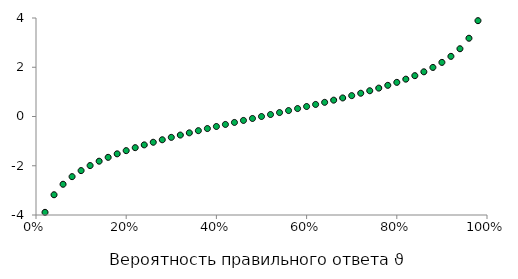
| Category | ln(k/(1-k)) |
|---|---|
| 1e-06 | -13.816 |
| 0.02 | -3.892 |
| 0.04 | -3.178 |
| 0.06 | -2.752 |
| 0.08 | -2.442 |
| 0.1 | -2.197 |
| 0.12 | -1.992 |
| 0.14 | -1.815 |
| 0.16 | -1.658 |
| 0.18 | -1.516 |
| 0.2 | -1.386 |
| 0.22 | -1.266 |
| 0.24 | -1.153 |
| 0.26 | -1.046 |
| 0.28 | -0.944 |
| 0.3 | -0.847 |
| 0.32 | -0.754 |
| 0.34 | -0.663 |
| 0.36 | -0.575 |
| 0.38 | -0.49 |
| 0.4 | -0.405 |
| 0.42 | -0.323 |
| 0.44 | -0.241 |
| 0.46 | -0.16 |
| 0.48 | -0.08 |
| 0.5 | 0 |
| 0.52 | 0.08 |
| 0.54 | 0.16 |
| 0.56 | 0.241 |
| 0.58 | 0.323 |
| 0.6 | 0.405 |
| 0.62 | 0.49 |
| 0.64 | 0.575 |
| 0.66 | 0.663 |
| 0.68 | 0.754 |
| 0.7 | 0.847 |
| 0.72 | 0.944 |
| 0.74 | 1.046 |
| 0.76 | 1.153 |
| 0.78 | 1.266 |
| 0.8 | 1.386 |
| 0.82 | 1.516 |
| 0.84 | 1.658 |
| 0.86 | 1.815 |
| 0.88 | 1.992 |
| 0.9 | 2.197 |
| 0.92 | 2.442 |
| 0.94 | 2.752 |
| 0.96 | 3.178 |
| 0.98 | 3.892 |
| 0.99999 | 11.513 |